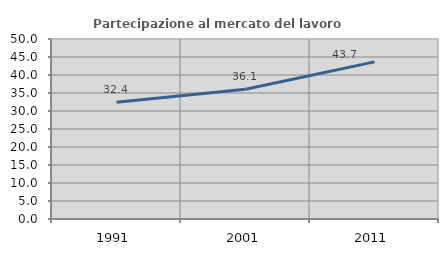
| Category | Partecipazione al mercato del lavoro  femminile |
|---|---|
| 1991.0 | 32.407 |
| 2001.0 | 36.065 |
| 2011.0 | 43.653 |